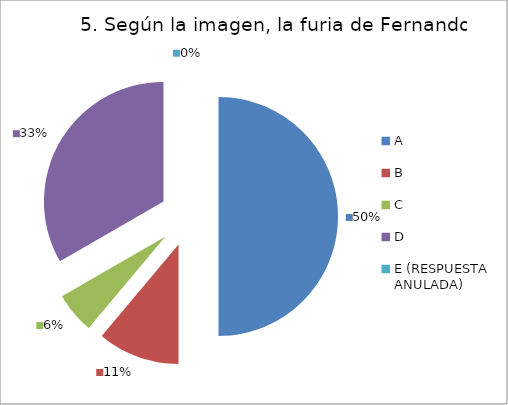
| Category | CANTIDAD DE RESPUESTAS PREGUNTA (5) | PORCENTAJE |
|---|---|---|
| A | 18 | 0.5 |
| B | 4 | 0.111 |
| C | 2 | 0.056 |
| D | 12 | 0.333 |
| E (RESPUESTA ANULADA) | 0 | 0 |